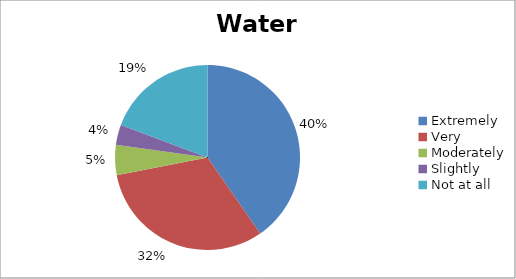
| Category | Water |
|---|---|
| Extremely | 23 |
| Very | 18 |
| Moderately | 3 |
| Slightly | 2 |
| Not at all | 11 |